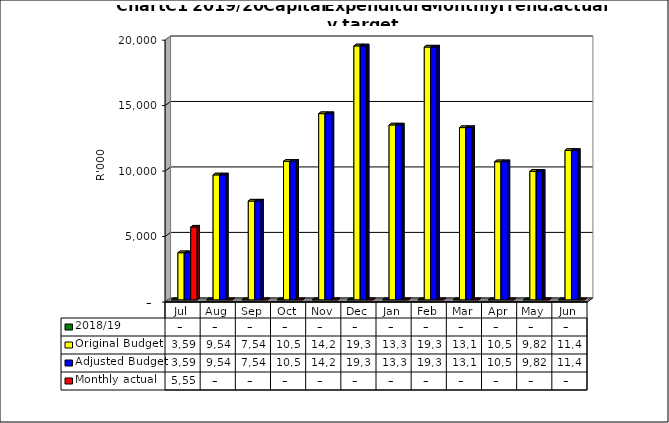
| Category | 2018/19 | Original Budget | Adjusted Budget | Monthly actual |
|---|---|---|---|---|
| Jul | 0 | 3597000 | 3597000 | 5554740.23 |
| Aug | 0 | 9540000 | 9540000 | 0 |
| Sep | 0 | 7545000 | 7545000 | 0 |
| Oct | 0 | 10583000 | 10583000 | 0 |
| Nov | 0 | 14220000 | 14220000 | 0 |
| Dec | 0 | 19396000 | 19396000 | 0 |
| Jan | 0 | 13356000 | 13356000 | 0 |
| Feb | 0 | 19309000 | 19309000 | 0 |
| Mar | 0 | 13155000 | 13155000 | 0 |
| Apr | 0 | 10547000 | 10547000 | 0 |
| May | 0 | 9821000 | 9821000 | 0 |
| Jun | 0 | 11417000 | 11417000 | 0 |